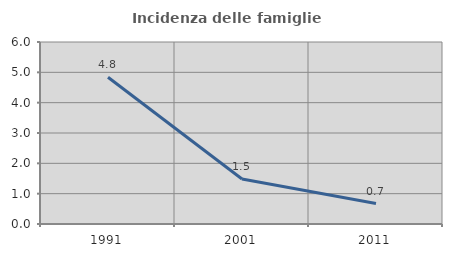
| Category | Incidenza delle famiglie numerose |
|---|---|
| 1991.0 | 4.839 |
| 2001.0 | 1.481 |
| 2011.0 | 0.676 |